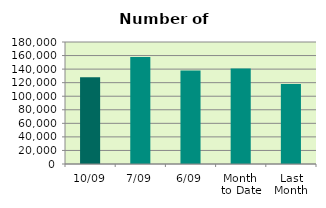
| Category | Series 0 |
|---|---|
| 10/09 | 128074 |
| 7/09 | 157858 |
| 6/09 | 138084 |
| Month 
to Date | 141024.333 |
| Last
Month | 118077.217 |